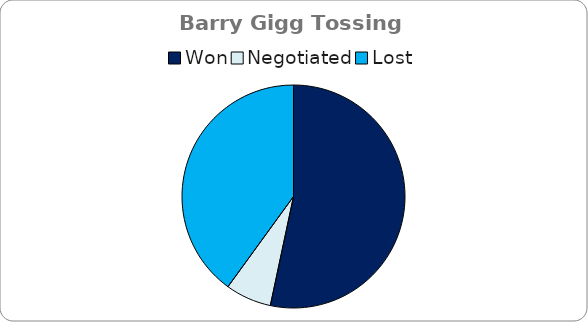
| Category | Barry Gigg |
|---|---|
| Won | 8 |
| Negotiated | 1 |
| Lost | 6 |